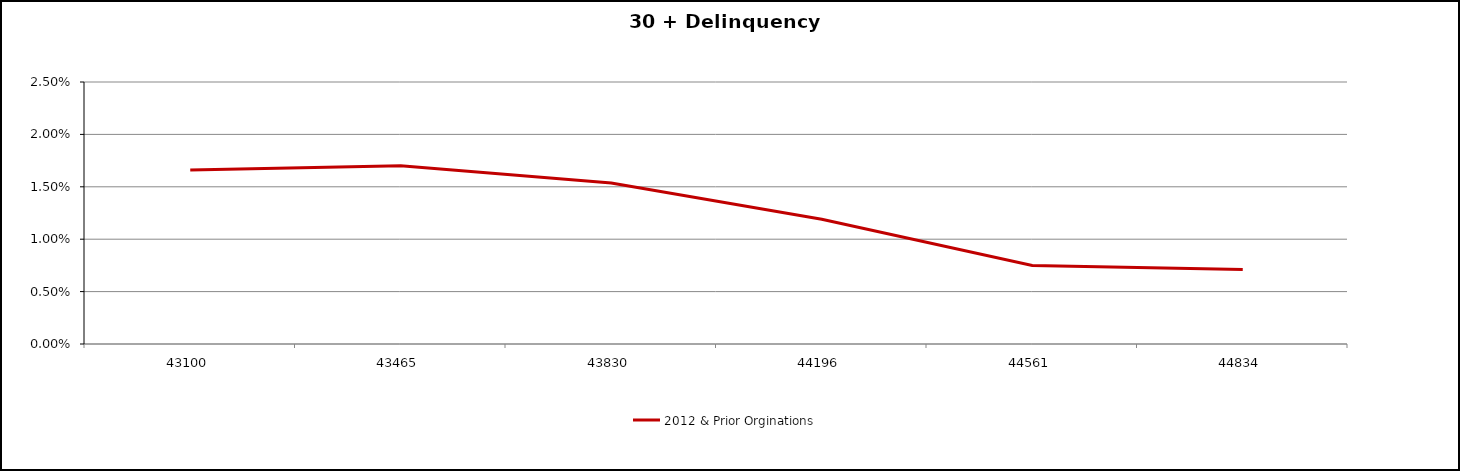
| Category | 2012 & Prior Orginations  |
|---|---|
| 2017-12-31 | 0.017 |
| 2018-12-31 | 0.017 |
| 2019-12-31 | 0.015 |
| 2020-12-31 | 0.012 |
| 2021-12-31 | 0.008 |
| 2022-09-30 | 0.007 |